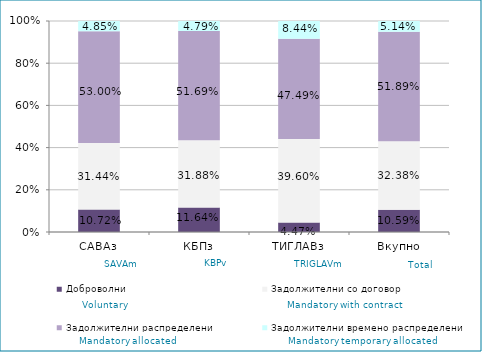
| Category | Доброволни  | Задолжителни со договор  | Задолжителни распределени  | Задолжителни времено распределени  |
|---|---|---|---|---|
| САВАз | 0.107 | 0.314 | 0.53 | 0.048 |
| КБПз | 0.116 | 0.319 | 0.517 | 0.048 |
| ТИГЛАВз | 0.045 | 0.396 | 0.475 | 0.084 |
| Вкупно | 0.106 | 0.324 | 0.519 | 0.051 |